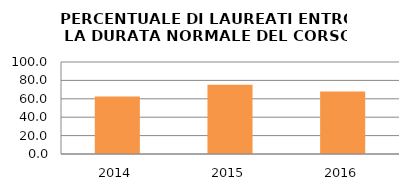
| Category | 2014 2015 2016 |
|---|---|
| 2014.0 | 62.609 |
| 2015.0 | 75.342 |
| 2016.0 | 67.901 |